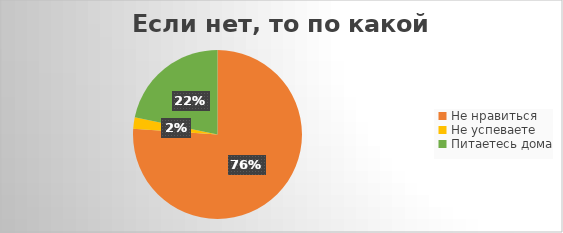
| Category | Series 0 |
|---|---|
| Не нравиться | 35 |
| Не успеваете | 1 |
| Питаетесь дома | 10 |